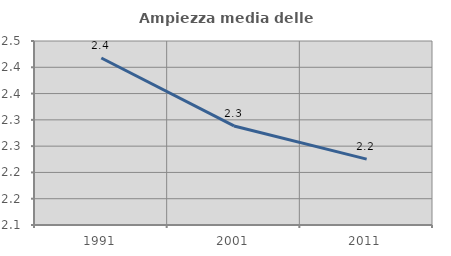
| Category | Ampiezza media delle famiglie |
|---|---|
| 1991.0 | 2.418 |
| 2001.0 | 2.288 |
| 2011.0 | 2.225 |